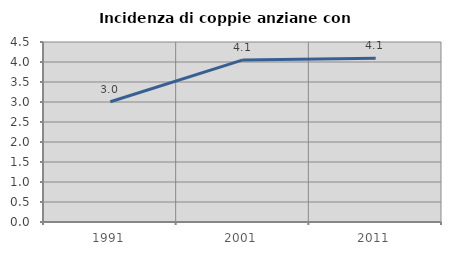
| Category | Incidenza di coppie anziane con figli |
|---|---|
| 1991.0 | 3.006 |
| 2001.0 | 4.052 |
| 2011.0 | 4.094 |